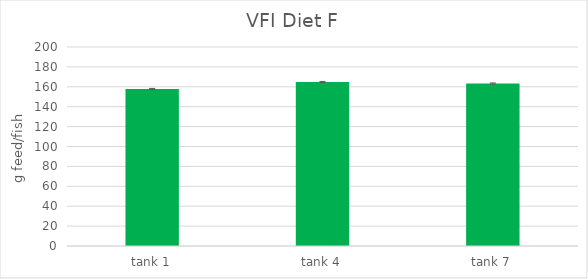
| Category | Diet F |
|---|---|
| tank 1 | 157.756 |
| tank 4 | 164.83 |
| tank 7 | 163.232 |